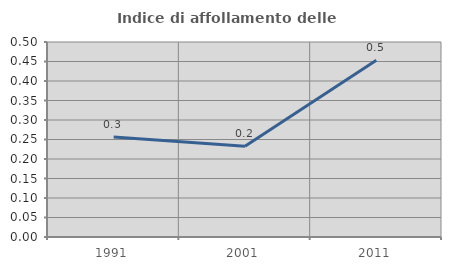
| Category | Indice di affollamento delle abitazioni  |
|---|---|
| 1991.0 | 0.256 |
| 2001.0 | 0.233 |
| 2011.0 | 0.454 |